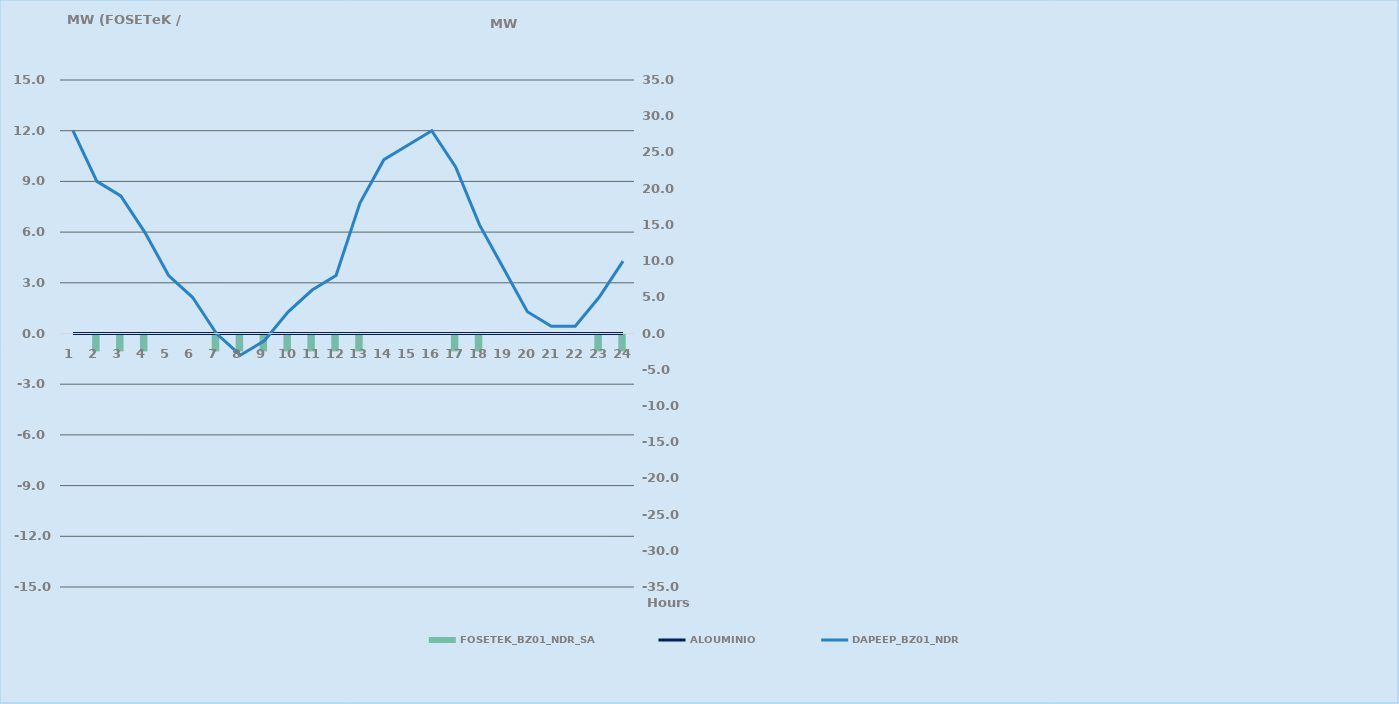
| Category | FOSETEK_BZ01_NDR_SA |
|---|---|
| 0 | 0 |
| 1 | -1 |
| 2 | -1 |
| 3 | -1 |
| 4 | 0 |
| 5 | 0 |
| 6 | -1 |
| 7 | -1 |
| 8 | -1 |
| 9 | -1 |
| 10 | -1 |
| 11 | -1 |
| 12 | -1 |
| 13 | 0 |
| 14 | 0 |
| 15 | 0 |
| 16 | -1 |
| 17 | -1 |
| 18 | 0 |
| 19 | 0 |
| 20 | 0 |
| 21 | 0 |
| 22 | -1 |
| 23 | -1 |